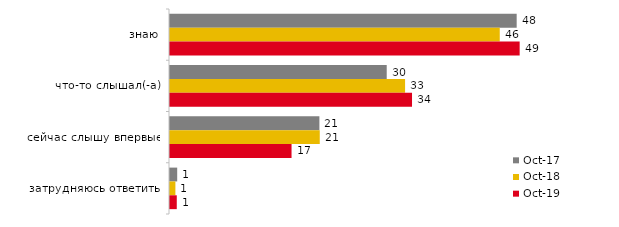
| Category | окт.17 | окт.18 | окт.19 |
|---|---|---|---|
| знаю | 48.15 | 45.8 | 48.564 |
| что-то слышал(-а) | 30.1 | 32.65 | 33.614 |
| сейчас слышу впервые | 20.75 | 20.8 | 16.881 |
| затрудняюсь ответить | 1 | 0.75 | 0.941 |